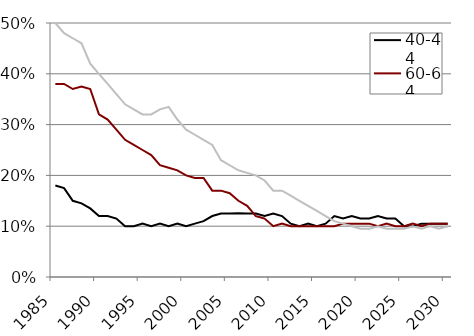
| Category | 40-44 | 60-64 | 70-74 |
|---|---|---|---|
| 1985.0 | 0.18 | 0.38 | 0.5 |
| 1986.0 | 0.175 | 0.38 | 0.48 |
| 1987.0 | 0.15 | 0.37 | 0.47 |
| 1988.0 | 0.145 | 0.375 | 0.46 |
| 1989.0 | 0.135 | 0.37 | 0.42 |
| 1990.0 | 0.12 | 0.32 | 0.4 |
| 1991.0 | 0.12 | 0.31 | 0.38 |
| 1992.0 | 0.115 | 0.29 | 0.36 |
| 1993.0 | 0.1 | 0.27 | 0.34 |
| 1994.0 | 0.1 | 0.26 | 0.33 |
| 1995.0 | 0.105 | 0.25 | 0.32 |
| 1996.0 | 0.1 | 0.24 | 0.32 |
| 1997.0 | 0.105 | 0.22 | 0.33 |
| 1998.0 | 0.1 | 0.215 | 0.335 |
| 1999.0 | 0.105 | 0.21 | 0.31 |
| 2000.0 | 0.1 | 0.2 | 0.29 |
| 2001.0 | 0.105 | 0.195 | 0.28 |
| 2002.0 | 0.11 | 0.195 | 0.27 |
| 2003.0 | 0.12 | 0.17 | 0.26 |
| 2004.0 | 0.125 | 0.17 | 0.23 |
| 2005.0 | 0.125 | 0.165 | 0.22 |
| 2006.0 | 0.126 | 0.15 | 0.21 |
| 2007.0 | 0.125 | 0.14 | 0.205 |
| 2008.0 | 0.125 | 0.12 | 0.2 |
| 2009.0 | 0.12 | 0.115 | 0.19 |
| 2010.0 | 0.125 | 0.1 | 0.17 |
| 2011.0 | 0.12 | 0.105 | 0.17 |
| 2012.0 | 0.105 | 0.1 | 0.16 |
| 2013.0 | 0.1 | 0.1 | 0.15 |
| 2014.0 | 0.105 | 0.1 | 0.14 |
| 2015.0 | 0.1 | 0.1 | 0.13 |
| 2016.0 | 0.105 | 0.1 | 0.12 |
| 2017.0 | 0.12 | 0.1 | 0.11 |
| 2018.0 | 0.115 | 0.105 | 0.105 |
| 2019.0 | 0.12 | 0.105 | 0.1 |
| 2020.0 | 0.115 | 0.105 | 0.095 |
| 2021.0 | 0.115 | 0.105 | 0.095 |
| 2022.0 | 0.12 | 0.1 | 0.1 |
| 2023.0 | 0.115 | 0.105 | 0.095 |
| 2024.0 | 0.115 | 0.1 | 0.095 |
| 2025.0 | 0.1 | 0.1 | 0.095 |
| 2026.0 | 0.1 | 0.105 | 0.1 |
| 2027.0 | 0.105 | 0.1 | 0.095 |
| 2028.0 | 0.105 | 0.105 | 0.1 |
| 2029.0 | 0.105 | 0.105 | 0.095 |
| 2030.0 | 0.105 | 0.105 | 0.1 |